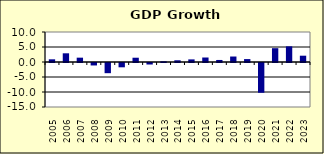
| Category | 3.7 |
|---|---|
| 2005.0 | 0.894 |
| 2006.0 | 2.899 |
| 2007.0 | 1.444 |
| 2008.0 | -0.819 |
| 2009.0 | -3.396 |
| 2010.0 | -1.435 |
| 2011.0 | 1.426 |
| 2012.0 | -0.501 |
| 2013.0 | 0.224 |
| 2014.0 | 0.575 |
| 2015.0 | 0.869 |
| 2016.0 | 1.498 |
| 2017.0 | 0.679 |
| 2018.0 | 1.827 |
| 2019.0 | 0.97 |
| 2020.0 | -9.92 |
| 2021.0 | 4.601 |
| 2022.0 | 5.222 |
| 2023.0 | 2.1 |